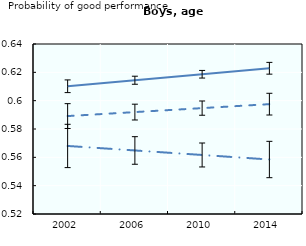
| Category | Healthy weight | Overweight | Obese |
|---|---|---|---|
| 2002.0 | 0.61 | 0.589 | 0.568 |
| 2006.0 | 0.614 | 0.592 | 0.565 |
| 2010.0 | 0.619 | 0.595 | 0.562 |
| 2014.0 | 0.623 | 0.598 | 0.558 |